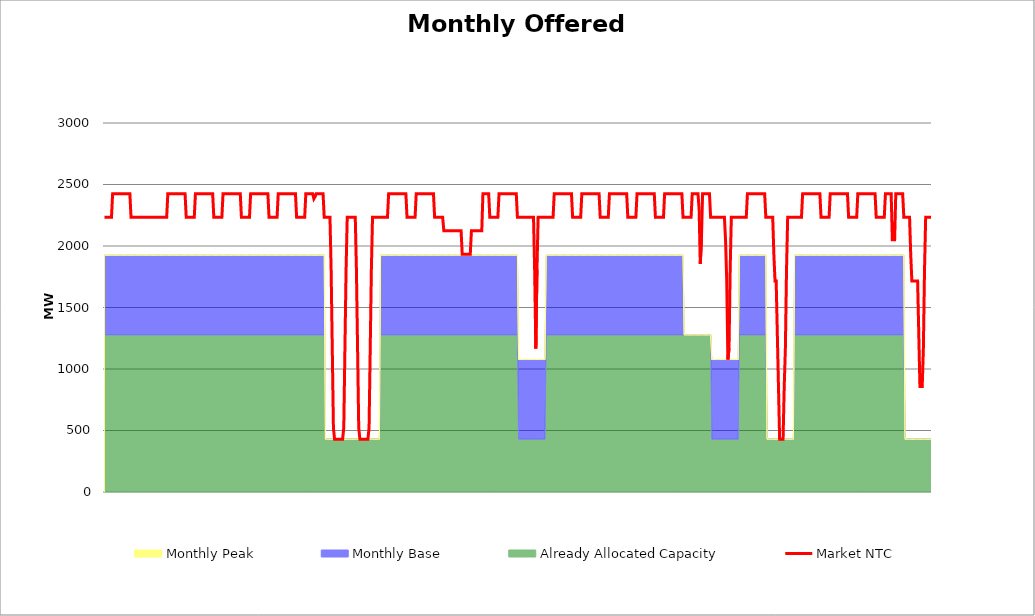
| Category | Market NTC |
|---|---|
| 0 | 2233 |
| 1 | 2233 |
| 2 | 2233 |
| 3 | 2233 |
| 4 | 2233 |
| 5 | 2233 |
| 6 | 2233 |
| 7 | 2425 |
| 8 | 2425 |
| 9 | 2425 |
| 10 | 2425 |
| 11 | 2425 |
| 12 | 2425 |
| 13 | 2425 |
| 14 | 2425 |
| 15 | 2425 |
| 16 | 2425 |
| 17 | 2425 |
| 18 | 2425 |
| 19 | 2425 |
| 20 | 2425 |
| 21 | 2425 |
| 22 | 2425 |
| 23 | 2233 |
| 24 | 2233 |
| 25 | 2233 |
| 26 | 2233 |
| 27 | 2233 |
| 28 | 2233 |
| 29 | 2233 |
| 30 | 2233 |
| 31 | 2233 |
| 32 | 2233 |
| 33 | 2233 |
| 34 | 2233 |
| 35 | 2233 |
| 36 | 2233 |
| 37 | 2233 |
| 38 | 2233 |
| 39 | 2233 |
| 40 | 2233 |
| 41 | 2233 |
| 42 | 2233 |
| 43 | 2233 |
| 44 | 2233 |
| 45 | 2233 |
| 46 | 2233 |
| 47 | 2233 |
| 48 | 2233 |
| 49 | 2233 |
| 50 | 2233 |
| 51 | 2233 |
| 52 | 2233 |
| 53 | 2233 |
| 54 | 2233 |
| 55 | 2425 |
| 56 | 2425 |
| 57 | 2425 |
| 58 | 2425 |
| 59 | 2425 |
| 60 | 2425 |
| 61 | 2425 |
| 62 | 2425 |
| 63 | 2425 |
| 64 | 2425 |
| 65 | 2425 |
| 66 | 2425 |
| 67 | 2425 |
| 68 | 2425 |
| 69 | 2425 |
| 70 | 2425 |
| 71 | 2233 |
| 72 | 2233 |
| 73 | 2233 |
| 74 | 2233 |
| 75 | 2233 |
| 76 | 2233 |
| 77 | 2233 |
| 78 | 2233 |
| 79 | 2425 |
| 80 | 2425 |
| 81 | 2425 |
| 82 | 2425 |
| 83 | 2425 |
| 84 | 2425 |
| 85 | 2425 |
| 86 | 2425 |
| 87 | 2425 |
| 88 | 2425 |
| 89 | 2425 |
| 90 | 2425 |
| 91 | 2425 |
| 92 | 2425 |
| 93 | 2425 |
| 94 | 2425 |
| 95 | 2233 |
| 96 | 2233 |
| 97 | 2233 |
| 98 | 2233 |
| 99 | 2233 |
| 100 | 2233 |
| 101 | 2233 |
| 102 | 2233 |
| 103 | 2425 |
| 104 | 2425 |
| 105 | 2425 |
| 106 | 2425 |
| 107 | 2425 |
| 108 | 2425 |
| 109 | 2425 |
| 110 | 2425 |
| 111 | 2425 |
| 112 | 2425 |
| 113 | 2425 |
| 114 | 2425 |
| 115 | 2425 |
| 116 | 2425 |
| 117 | 2425 |
| 118 | 2425 |
| 119 | 2233 |
| 120 | 2233 |
| 121 | 2233 |
| 122 | 2233 |
| 123 | 2233 |
| 124 | 2233 |
| 125 | 2233 |
| 126 | 2233 |
| 127 | 2425 |
| 128 | 2425 |
| 129 | 2425 |
| 130 | 2425 |
| 131 | 2425 |
| 132 | 2425 |
| 133 | 2425 |
| 134 | 2425 |
| 135 | 2425 |
| 136 | 2425 |
| 137 | 2425 |
| 138 | 2425 |
| 139 | 2425 |
| 140 | 2425 |
| 141 | 2425 |
| 142 | 2425 |
| 143 | 2233 |
| 144 | 2233 |
| 145 | 2233 |
| 146 | 2233 |
| 147 | 2233 |
| 148 | 2233 |
| 149 | 2233 |
| 150 | 2233 |
| 151 | 2425 |
| 152 | 2425 |
| 153 | 2425 |
| 154 | 2425 |
| 155 | 2425 |
| 156 | 2425 |
| 157 | 2425 |
| 158 | 2425 |
| 159 | 2425 |
| 160 | 2425 |
| 161 | 2425 |
| 162 | 2425 |
| 163 | 2425 |
| 164 | 2425 |
| 165 | 2425 |
| 166 | 2425 |
| 167 | 2233 |
| 168 | 2233 |
| 169 | 2233 |
| 170 | 2233 |
| 171 | 2233 |
| 172 | 2233 |
| 173 | 2233 |
| 174 | 2233 |
| 175 | 2425 |
| 176 | 2425 |
| 177 | 2425 |
| 178 | 2425 |
| 179 | 2425 |
| 180 | 2425 |
| 181 | 2425 |
| 182 | 2384 |
| 183 | 2400 |
| 184 | 2425 |
| 185 | 2425 |
| 186 | 2425 |
| 187 | 2425 |
| 188 | 2425 |
| 189 | 2425 |
| 190 | 2425 |
| 191 | 2233 |
| 192 | 2233 |
| 193 | 2233 |
| 194 | 2233 |
| 195 | 2233 |
| 196 | 2233 |
| 197 | 1809 |
| 198 | 1166 |
| 199 | 523 |
| 200 | 429 |
| 201 | 429 |
| 202 | 429 |
| 203 | 429 |
| 204 | 429 |
| 205 | 429 |
| 206 | 429 |
| 207 | 429 |
| 208 | 523 |
| 209 | 1166 |
| 210 | 1809 |
| 211 | 2233 |
| 212 | 2233 |
| 213 | 2233 |
| 214 | 2233 |
| 215 | 2233 |
| 216 | 2233 |
| 217 | 2233 |
| 218 | 2233 |
| 219 | 1809 |
| 220 | 1166 |
| 221 | 523 |
| 222 | 429 |
| 223 | 429 |
| 224 | 429 |
| 225 | 429 |
| 226 | 429 |
| 227 | 429 |
| 228 | 429 |
| 229 | 429 |
| 230 | 523 |
| 231 | 1166 |
| 232 | 1809 |
| 233 | 2233 |
| 234 | 2233 |
| 235 | 2233 |
| 236 | 2233 |
| 237 | 2233 |
| 238 | 2233 |
| 239 | 2233 |
| 240 | 2233 |
| 241 | 2233 |
| 242 | 2233 |
| 243 | 2233 |
| 244 | 2233 |
| 245 | 2233 |
| 246 | 2233 |
| 247 | 2425 |
| 248 | 2425 |
| 249 | 2425 |
| 250 | 2425 |
| 251 | 2425 |
| 252 | 2425 |
| 253 | 2425 |
| 254 | 2425 |
| 255 | 2425 |
| 256 | 2425 |
| 257 | 2425 |
| 258 | 2425 |
| 259 | 2425 |
| 260 | 2425 |
| 261 | 2425 |
| 262 | 2425 |
| 263 | 2233 |
| 264 | 2233 |
| 265 | 2233 |
| 266 | 2233 |
| 267 | 2233 |
| 268 | 2233 |
| 269 | 2233 |
| 270 | 2233 |
| 271 | 2425 |
| 272 | 2425 |
| 273 | 2425 |
| 274 | 2425 |
| 275 | 2425 |
| 276 | 2425 |
| 277 | 2425 |
| 278 | 2425 |
| 279 | 2425 |
| 280 | 2425 |
| 281 | 2425 |
| 282 | 2425 |
| 283 | 2425 |
| 284 | 2425 |
| 285 | 2425 |
| 286 | 2425 |
| 287 | 2233 |
| 288 | 2233 |
| 289 | 2233 |
| 290 | 2233 |
| 291 | 2233 |
| 292 | 2233 |
| 293 | 2233 |
| 294 | 2233 |
| 295 | 2125 |
| 296 | 2125 |
| 297 | 2125 |
| 298 | 2125 |
| 299 | 2125 |
| 300 | 2125 |
| 301 | 2125 |
| 302 | 2125 |
| 303 | 2125 |
| 304 | 2125 |
| 305 | 2125 |
| 306 | 2125 |
| 307 | 2125 |
| 308 | 2125 |
| 309 | 2125 |
| 310 | 2125 |
| 311 | 1933 |
| 312 | 1933 |
| 313 | 1933 |
| 314 | 1933 |
| 315 | 1933 |
| 316 | 1933 |
| 317 | 1933 |
| 318 | 1933 |
| 319 | 2125 |
| 320 | 2125 |
| 321 | 2125 |
| 322 | 2125 |
| 323 | 2125 |
| 324 | 2125 |
| 325 | 2125 |
| 326 | 2125 |
| 327 | 2125 |
| 328 | 2125 |
| 329 | 2425 |
| 330 | 2425 |
| 331 | 2425 |
| 332 | 2425 |
| 333 | 2425 |
| 334 | 2425 |
| 335 | 2233 |
| 336 | 2233 |
| 337 | 2233 |
| 338 | 2233 |
| 339 | 2233 |
| 340 | 2233 |
| 341 | 2233 |
| 342 | 2233 |
| 343 | 2425 |
| 344 | 2425 |
| 345 | 2425 |
| 346 | 2425 |
| 347 | 2425 |
| 348 | 2425 |
| 349 | 2425 |
| 350 | 2425 |
| 351 | 2425 |
| 352 | 2425 |
| 353 | 2425 |
| 354 | 2425 |
| 355 | 2425 |
| 356 | 2425 |
| 357 | 2425 |
| 358 | 2425 |
| 359 | 2233 |
| 360 | 2233 |
| 361 | 2233 |
| 362 | 2233 |
| 363 | 2233 |
| 364 | 2233 |
| 365 | 2233 |
| 366 | 2233 |
| 367 | 2233 |
| 368 | 2233 |
| 369 | 2233 |
| 370 | 2233 |
| 371 | 2233 |
| 372 | 2233 |
| 373 | 2233 |
| 374 | 1790 |
| 375 | 1166 |
| 376 | 1809 |
| 377 | 2233 |
| 378 | 2233 |
| 379 | 2233 |
| 380 | 2233 |
| 381 | 2233 |
| 382 | 2233 |
| 383 | 2233 |
| 384 | 2233 |
| 385 | 2233 |
| 386 | 2233 |
| 387 | 2233 |
| 388 | 2233 |
| 389 | 2233 |
| 390 | 2233 |
| 391 | 2425 |
| 392 | 2425 |
| 393 | 2425 |
| 394 | 2425 |
| 395 | 2425 |
| 396 | 2425 |
| 397 | 2425 |
| 398 | 2425 |
| 399 | 2425 |
| 400 | 2425 |
| 401 | 2425 |
| 402 | 2425 |
| 403 | 2425 |
| 404 | 2425 |
| 405 | 2425 |
| 406 | 2425 |
| 407 | 2233 |
| 408 | 2233 |
| 409 | 2233 |
| 410 | 2233 |
| 411 | 2233 |
| 412 | 2233 |
| 413 | 2233 |
| 414 | 2233 |
| 415 | 2425 |
| 416 | 2425 |
| 417 | 2425 |
| 418 | 2425 |
| 419 | 2425 |
| 420 | 2425 |
| 421 | 2425 |
| 422 | 2425 |
| 423 | 2425 |
| 424 | 2425 |
| 425 | 2425 |
| 426 | 2425 |
| 427 | 2425 |
| 428 | 2425 |
| 429 | 2425 |
| 430 | 2425 |
| 431 | 2233 |
| 432 | 2233 |
| 433 | 2233 |
| 434 | 2233 |
| 435 | 2233 |
| 436 | 2233 |
| 437 | 2233 |
| 438 | 2233 |
| 439 | 2425 |
| 440 | 2425 |
| 441 | 2425 |
| 442 | 2425 |
| 443 | 2425 |
| 444 | 2425 |
| 445 | 2425 |
| 446 | 2425 |
| 447 | 2425 |
| 448 | 2425 |
| 449 | 2425 |
| 450 | 2425 |
| 451 | 2425 |
| 452 | 2425 |
| 453 | 2425 |
| 454 | 2425 |
| 455 | 2233 |
| 456 | 2233 |
| 457 | 2233 |
| 458 | 2233 |
| 459 | 2233 |
| 460 | 2233 |
| 461 | 2233 |
| 462 | 2233 |
| 463 | 2425 |
| 464 | 2425 |
| 465 | 2425 |
| 466 | 2425 |
| 467 | 2425 |
| 468 | 2425 |
| 469 | 2425 |
| 470 | 2425 |
| 471 | 2425 |
| 472 | 2425 |
| 473 | 2425 |
| 474 | 2425 |
| 475 | 2425 |
| 476 | 2425 |
| 477 | 2425 |
| 478 | 2425 |
| 479 | 2233 |
| 480 | 2233 |
| 481 | 2233 |
| 482 | 2233 |
| 483 | 2233 |
| 484 | 2233 |
| 485 | 2233 |
| 486 | 2233 |
| 487 | 2425 |
| 488 | 2425 |
| 489 | 2425 |
| 490 | 2425 |
| 491 | 2425 |
| 492 | 2425 |
| 493 | 2425 |
| 494 | 2425 |
| 495 | 2425 |
| 496 | 2425 |
| 497 | 2425 |
| 498 | 2425 |
| 499 | 2425 |
| 500 | 2425 |
| 501 | 2425 |
| 502 | 2425 |
| 503 | 2233 |
| 504 | 2233 |
| 505 | 2233 |
| 506 | 2233 |
| 507 | 2233 |
| 508 | 2233 |
| 509 | 2233 |
| 510 | 2233 |
| 511 | 2425 |
| 512 | 2425 |
| 513 | 2425 |
| 514 | 2425 |
| 515 | 2425 |
| 516 | 2425 |
| 517 | 2296 |
| 518 | 1855 |
| 519 | 2051 |
| 520 | 2425 |
| 521 | 2425 |
| 522 | 2425 |
| 523 | 2425 |
| 524 | 2425 |
| 525 | 2425 |
| 526 | 2425 |
| 527 | 2233 |
| 528 | 2233 |
| 529 | 2233 |
| 530 | 2233 |
| 531 | 2233 |
| 532 | 2233 |
| 533 | 2233 |
| 534 | 2233 |
| 535 | 2233 |
| 536 | 2233 |
| 537 | 2233 |
| 538 | 2233 |
| 539 | 2233 |
| 540 | 2043 |
| 541 | 1720 |
| 542 | 1077 |
| 543 | 1166 |
| 544 | 1809 |
| 545 | 2233 |
| 546 | 2233 |
| 547 | 2233 |
| 548 | 2233 |
| 549 | 2233 |
| 550 | 2233 |
| 551 | 2233 |
| 552 | 2233 |
| 553 | 2233 |
| 554 | 2233 |
| 555 | 2233 |
| 556 | 2233 |
| 557 | 2233 |
| 558 | 2233 |
| 559 | 2425 |
| 560 | 2425 |
| 561 | 2425 |
| 562 | 2425 |
| 563 | 2425 |
| 564 | 2425 |
| 565 | 2425 |
| 566 | 2425 |
| 567 | 2425 |
| 568 | 2425 |
| 569 | 2425 |
| 570 | 2425 |
| 571 | 2425 |
| 572 | 2425 |
| 573 | 2425 |
| 574 | 2425 |
| 575 | 2233 |
| 576 | 2233 |
| 577 | 2233 |
| 578 | 2233 |
| 579 | 2233 |
| 580 | 2233 |
| 581 | 2233 |
| 582 | 1929 |
| 583 | 1715 |
| 584 | 1715 |
| 585 | 1286 |
| 586 | 857 |
| 587 | 429 |
| 588 | 429 |
| 589 | 429 |
| 590 | 429 |
| 591 | 857 |
| 592 | 1166 |
| 593 | 1809 |
| 594 | 2233 |
| 595 | 2233 |
| 596 | 2233 |
| 597 | 2233 |
| 598 | 2233 |
| 599 | 2233 |
| 600 | 2233 |
| 601 | 2233 |
| 602 | 2233 |
| 603 | 2233 |
| 604 | 2233 |
| 605 | 2233 |
| 606 | 2233 |
| 607 | 2425 |
| 608 | 2425 |
| 609 | 2425 |
| 610 | 2425 |
| 611 | 2425 |
| 612 | 2425 |
| 613 | 2425 |
| 614 | 2425 |
| 615 | 2425 |
| 616 | 2425 |
| 617 | 2425 |
| 618 | 2425 |
| 619 | 2425 |
| 620 | 2425 |
| 621 | 2425 |
| 622 | 2425 |
| 623 | 2233 |
| 624 | 2233 |
| 625 | 2233 |
| 626 | 2233 |
| 627 | 2233 |
| 628 | 2233 |
| 629 | 2233 |
| 630 | 2233 |
| 631 | 2425 |
| 632 | 2425 |
| 633 | 2425 |
| 634 | 2425 |
| 635 | 2425 |
| 636 | 2425 |
| 637 | 2425 |
| 638 | 2425 |
| 639 | 2425 |
| 640 | 2425 |
| 641 | 2425 |
| 642 | 2425 |
| 643 | 2425 |
| 644 | 2425 |
| 645 | 2425 |
| 646 | 2425 |
| 647 | 2233 |
| 648 | 2233 |
| 649 | 2233 |
| 650 | 2233 |
| 651 | 2233 |
| 652 | 2233 |
| 653 | 2233 |
| 654 | 2233 |
| 655 | 2425 |
| 656 | 2425 |
| 657 | 2425 |
| 658 | 2425 |
| 659 | 2425 |
| 660 | 2425 |
| 661 | 2425 |
| 662 | 2425 |
| 663 | 2425 |
| 664 | 2425 |
| 665 | 2425 |
| 666 | 2425 |
| 667 | 2425 |
| 668 | 2425 |
| 669 | 2425 |
| 670 | 2425 |
| 671 | 2233 |
| 672 | 2233 |
| 673 | 2233 |
| 674 | 2233 |
| 675 | 2233 |
| 676 | 2233 |
| 677 | 2233 |
| 678 | 2233 |
| 679 | 2425 |
| 680 | 2425 |
| 681 | 2425 |
| 682 | 2425 |
| 683 | 2425 |
| 684 | 2425 |
| 685 | 2051 |
| 686 | 2051 |
| 687 | 2051 |
| 688 | 2425 |
| 689 | 2425 |
| 690 | 2425 |
| 691 | 2425 |
| 692 | 2425 |
| 693 | 2425 |
| 694 | 2425 |
| 695 | 2233 |
| 696 | 2233 |
| 697 | 2233 |
| 698 | 2233 |
| 699 | 2233 |
| 700 | 2233 |
| 701 | 1929 |
| 702 | 1715 |
| 703 | 1715 |
| 704 | 1715 |
| 705 | 1715 |
| 706 | 1715 |
| 707 | 1715 |
| 708 | 1286 |
| 709 | 857 |
| 710 | 857 |
| 711 | 857 |
| 712 | 1166 |
| 713 | 1809 |
| 714 | 2233 |
| 715 | 2233 |
| 716 | 2233 |
| 717 | 2233 |
| 718 | 2233 |
| 719 | 2233 |